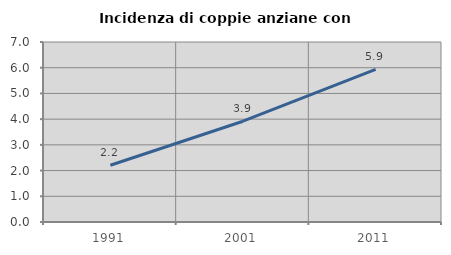
| Category | Incidenza di coppie anziane con figli |
|---|---|
| 1991.0 | 2.207 |
| 2001.0 | 3.919 |
| 2011.0 | 5.933 |